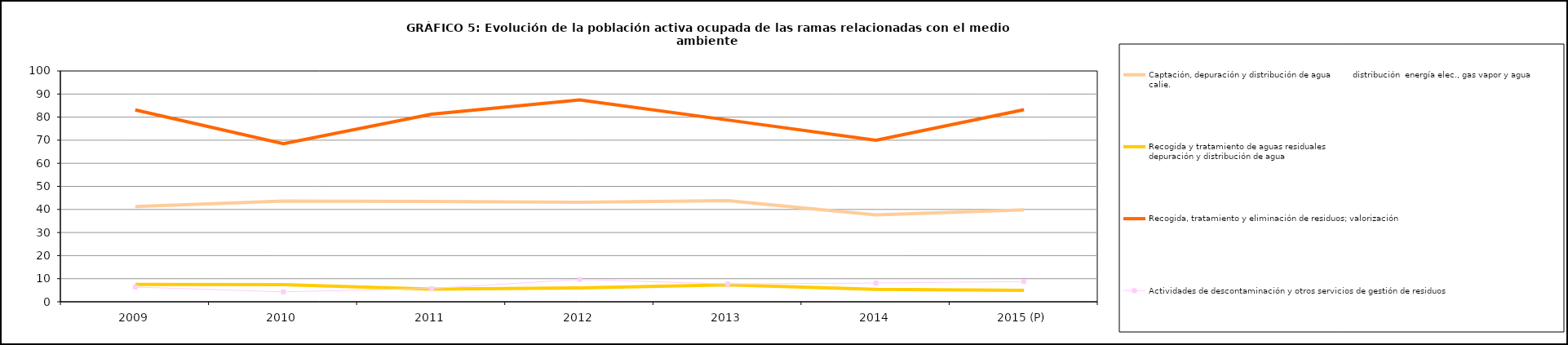
| Category | Captación, depuración y distribución de agua         distribución  energía elec., gas vapor y agua calie. | Recogida y tratamiento de aguas residuales                                                                                 depuración y distribución de agua | Recogida, tratamiento y eliminación de residuos; valorización       | Actividades de descontaminación y otros servicios de gestión de residuos  |
|---|---|---|---|---|
| 2009 | 41.25 | 7.525 | 83.125 | 6.375 |
| 2010 | 43.675 | 7.425 | 68.45 | 4.3 |
| 2011 | 43.425 | 5.5 | 81.275 | 5.75 |
| 2012 | 43.1 | 6.05 | 87.45 | 9.675 |
| 2013 | 43.8 | 7.3 | 78.75 | 7.7 |
| 2014 | 37.675 | 5.35 | 70 | 8.125 |
| 2015 (P) | 39.85 | 4.975 | 83.225 | 8.75 |